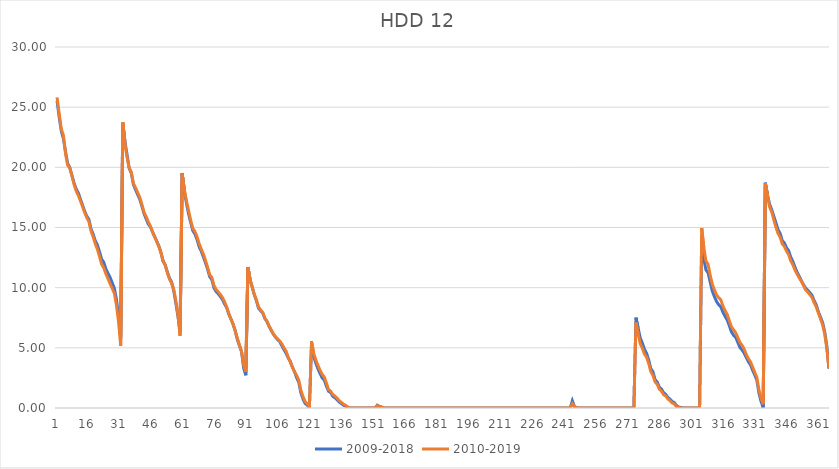
| Category | 2009-2018 | 2010-2019 |
|---|---|---|
| 0 | 25.52 | 25.81 |
| 1 | 24.18 | 24.47 |
| 2 | 23 | 23.18 |
| 3 | 22.38 | 22.66 |
| 4 | 21.29 | 21.13 |
| 5 | 20.32 | 20.18 |
| 6 | 19.98 | 19.94 |
| 7 | 19.34 | 19.31 |
| 8 | 18.72 | 18.59 |
| 9 | 18.21 | 18.03 |
| 10 | 17.87 | 17.68 |
| 11 | 17.36 | 17.23 |
| 12 | 16.86 | 16.74 |
| 13 | 16.36 | 16.25 |
| 14 | 15.95 | 15.82 |
| 15 | 15.67 | 15.5 |
| 16 | 14.88 | 14.72 |
| 17 | 14.46 | 14.23 |
| 18 | 13.91 | 13.66 |
| 19 | 13.57 | 13.2 |
| 20 | 12.99 | 12.6 |
| 21 | 12.38 | 11.96 |
| 22 | 12.12 | 11.66 |
| 23 | 11.57 | 11.15 |
| 24 | 11.2 | 10.74 |
| 25 | 10.86 | 10.33 |
| 26 | 10.4 | 9.93 |
| 27 | 9.96 | 9.53 |
| 28 | 9.03 | 8.56 |
| 29 | 7.66 | 7.17 |
| 30 | 5.83 | 5.18 |
| 31 | 23.65 | 23.74 |
| 32 | 22.16 | 21.98 |
| 33 | 21.05 | 20.85 |
| 34 | 19.93 | 19.97 |
| 35 | 19.52 | 19.6 |
| 36 | 18.57 | 18.67 |
| 37 | 18.14 | 18.32 |
| 38 | 17.74 | 17.91 |
| 39 | 17.35 | 17.51 |
| 40 | 16.77 | 16.93 |
| 41 | 16.16 | 16.27 |
| 42 | 15.72 | 15.91 |
| 43 | 15.29 | 15.48 |
| 44 | 15.06 | 15.12 |
| 45 | 14.64 | 14.65 |
| 46 | 14.24 | 14.23 |
| 47 | 13.88 | 13.82 |
| 48 | 13.45 | 13.43 |
| 49 | 12.91 | 12.91 |
| 50 | 12.21 | 12.21 |
| 51 | 11.89 | 11.86 |
| 52 | 11.31 | 11.26 |
| 53 | 10.8 | 10.72 |
| 54 | 10.47 | 10.38 |
| 55 | 9.76 | 9.88 |
| 56 | 8.74 | 8.94 |
| 57 | 7.63 | 7.78 |
| 58 | 6.33 | 6 |
| 59 | 19.5 | 19.46 |
| 60 | 18.04 | 18.18 |
| 61 | 17.04 | 17.23 |
| 62 | 16.14 | 16.43 |
| 63 | 15.43 | 15.61 |
| 64 | 14.74 | 14.94 |
| 65 | 14.46 | 14.67 |
| 66 | 14.01 | 14.25 |
| 67 | 13.4 | 13.66 |
| 68 | 13.03 | 13.21 |
| 69 | 12.56 | 12.79 |
| 70 | 12.06 | 12.26 |
| 71 | 11.53 | 11.69 |
| 72 | 10.91 | 11.08 |
| 73 | 10.66 | 10.85 |
| 74 | 9.98 | 10.18 |
| 75 | 9.68 | 9.85 |
| 76 | 9.49 | 9.65 |
| 77 | 9.27 | 9.43 |
| 78 | 9.01 | 9.19 |
| 79 | 8.64 | 8.82 |
| 80 | 8.34 | 8.38 |
| 81 | 7.8 | 7.84 |
| 82 | 7.4 | 7.38 |
| 83 | 6.96 | 6.99 |
| 84 | 6.44 | 6.4 |
| 85 | 5.7 | 5.8 |
| 86 | 5.19 | 5.24 |
| 87 | 4.67 | 4.69 |
| 88 | 3.31 | 3.56 |
| 89 | 2.72 | 3 |
| 90 | 11.71 | 11.69 |
| 91 | 10.7 | 10.69 |
| 92 | 10.07 | 10.06 |
| 93 | 9.42 | 9.44 |
| 94 | 8.92 | 8.99 |
| 95 | 8.3 | 8.4 |
| 96 | 8.08 | 8.16 |
| 97 | 7.9 | 7.93 |
| 98 | 7.44 | 7.46 |
| 99 | 7.18 | 7.21 |
| 100 | 6.77 | 6.81 |
| 101 | 6.44 | 6.49 |
| 102 | 6.14 | 6.16 |
| 103 | 5.89 | 5.92 |
| 104 | 5.69 | 5.75 |
| 105 | 5.52 | 5.58 |
| 106 | 5.18 | 5.33 |
| 107 | 4.85 | 5.01 |
| 108 | 4.55 | 4.73 |
| 109 | 4.16 | 4.22 |
| 110 | 3.87 | 3.82 |
| 111 | 3.39 | 3.36 |
| 112 | 3.01 | 3 |
| 113 | 2.51 | 2.7 |
| 114 | 2.13 | 2.3 |
| 115 | 1.25 | 1.47 |
| 116 | 0.74 | 0.94 |
| 117 | 0.38 | 0.52 |
| 118 | 0.23 | 0.35 |
| 119 | 0.05 | 0.05 |
| 120 | 5.22 | 5.55 |
| 121 | 4.27 | 4.55 |
| 122 | 3.74 | 4.01 |
| 123 | 3.27 | 3.56 |
| 124 | 2.87 | 3.14 |
| 125 | 2.51 | 2.8 |
| 126 | 2.33 | 2.58 |
| 127 | 1.83 | 2.08 |
| 128 | 1.4 | 1.54 |
| 129 | 1.3 | 1.41 |
| 130 | 0.98 | 1.12 |
| 131 | 0.85 | 0.99 |
| 132 | 0.7 | 0.83 |
| 133 | 0.5 | 0.62 |
| 134 | 0.38 | 0.48 |
| 135 | 0.24 | 0.33 |
| 136 | 0.16 | 0.23 |
| 137 | 0.05 | 0.1 |
| 138 | 0 | 0 |
| 139 | 0 | 0 |
| 140 | 0 | 0 |
| 141 | 0 | 0 |
| 142 | 0 | 0 |
| 143 | 0 | 0 |
| 144 | 0 | 0 |
| 145 | 0 | 0 |
| 146 | 0 | 0 |
| 147 | 0 | 0 |
| 148 | 0 | 0 |
| 149 | 0 | 0 |
| 150 | 0 | 0 |
| 151 | 0.23 | 0.2 |
| 152 | 0.14 | 0.1 |
| 153 | 0.08 | 0.08 |
| 154 | 0 | 0 |
| 155 | 0 | 0 |
| 156 | 0 | 0 |
| 157 | 0 | 0 |
| 158 | 0 | 0 |
| 159 | 0 | 0 |
| 160 | 0 | 0 |
| 161 | 0 | 0 |
| 162 | 0 | 0 |
| 163 | 0 | 0 |
| 164 | 0 | 0 |
| 165 | 0 | 0 |
| 166 | 0 | 0 |
| 167 | 0 | 0 |
| 168 | 0 | 0 |
| 169 | 0 | 0 |
| 170 | 0 | 0 |
| 171 | 0 | 0 |
| 172 | 0 | 0 |
| 173 | 0 | 0 |
| 174 | 0 | 0 |
| 175 | 0 | 0 |
| 176 | 0 | 0 |
| 177 | 0 | 0 |
| 178 | 0 | 0 |
| 179 | 0 | 0 |
| 180 | 0 | 0 |
| 181 | 0 | 0 |
| 182 | 0 | 0 |
| 183 | 0 | 0 |
| 184 | 0 | 0 |
| 185 | 0 | 0 |
| 186 | 0 | 0 |
| 187 | 0 | 0 |
| 188 | 0 | 0 |
| 189 | 0 | 0 |
| 190 | 0 | 0 |
| 191 | 0 | 0 |
| 192 | 0 | 0 |
| 193 | 0 | 0 |
| 194 | 0 | 0 |
| 195 | 0 | 0 |
| 196 | 0 | 0 |
| 197 | 0 | 0 |
| 198 | 0 | 0 |
| 199 | 0 | 0 |
| 200 | 0 | 0 |
| 201 | 0 | 0 |
| 202 | 0 | 0 |
| 203 | 0 | 0 |
| 204 | 0 | 0 |
| 205 | 0 | 0 |
| 206 | 0 | 0 |
| 207 | 0 | 0 |
| 208 | 0 | 0 |
| 209 | 0 | 0 |
| 210 | 0 | 0 |
| 211 | 0 | 0 |
| 212 | 0 | 0 |
| 213 | 0 | 0 |
| 214 | 0 | 0 |
| 215 | 0 | 0 |
| 216 | 0 | 0 |
| 217 | 0 | 0 |
| 218 | 0 | 0 |
| 219 | 0 | 0 |
| 220 | 0 | 0 |
| 221 | 0 | 0 |
| 222 | 0 | 0 |
| 223 | 0 | 0 |
| 224 | 0 | 0 |
| 225 | 0 | 0 |
| 226 | 0 | 0 |
| 227 | 0 | 0 |
| 228 | 0 | 0 |
| 229 | 0 | 0 |
| 230 | 0 | 0 |
| 231 | 0 | 0 |
| 232 | 0 | 0 |
| 233 | 0 | 0 |
| 234 | 0 | 0 |
| 235 | 0 | 0 |
| 236 | 0 | 0 |
| 237 | 0 | 0 |
| 238 | 0 | 0 |
| 239 | 0 | 0 |
| 240 | 0 | 0 |
| 241 | 0 | 0 |
| 242 | 0 | 0 |
| 243 | 0.6 | 0.36 |
| 244 | 0.1 | 0.1 |
| 245 | 0.03 | 0.03 |
| 246 | 0 | 0 |
| 247 | 0 | 0 |
| 248 | 0 | 0 |
| 249 | 0 | 0 |
| 250 | 0 | 0 |
| 251 | 0 | 0 |
| 252 | 0 | 0 |
| 253 | 0 | 0 |
| 254 | 0 | 0 |
| 255 | 0 | 0 |
| 256 | 0 | 0 |
| 257 | 0 | 0 |
| 258 | 0 | 0 |
| 259 | 0 | 0 |
| 260 | 0 | 0 |
| 261 | 0 | 0 |
| 262 | 0 | 0 |
| 263 | 0 | 0 |
| 264 | 0 | 0 |
| 265 | 0 | 0 |
| 266 | 0 | 0 |
| 267 | 0 | 0 |
| 268 | 0 | 0 |
| 269 | 0 | 0 |
| 270 | 0 | 0 |
| 271 | 0 | 0 |
| 272 | 0 | 0 |
| 273 | 7.51 | 7.11 |
| 274 | 6.66 | 6.18 |
| 275 | 5.83 | 5.35 |
| 276 | 5.39 | 4.97 |
| 277 | 4.89 | 4.48 |
| 278 | 4.54 | 4.23 |
| 279 | 3.99 | 3.7 |
| 280 | 3.27 | 3.02 |
| 281 | 3.02 | 2.72 |
| 282 | 2.36 | 2.17 |
| 283 | 2.17 | 1.98 |
| 284 | 1.73 | 1.57 |
| 285 | 1.58 | 1.41 |
| 286 | 1.28 | 1.11 |
| 287 | 1.14 | 1 |
| 288 | 0.89 | 0.76 |
| 289 | 0.74 | 0.62 |
| 290 | 0.55 | 0.43 |
| 291 | 0.46 | 0.35 |
| 292 | 0.23 | 0.13 |
| 293 | 0.09 | 0.04 |
| 294 | 0.04 | 0 |
| 295 | 0.01 | 0 |
| 296 | 0 | 0 |
| 297 | 0 | 0 |
| 298 | 0 | 0 |
| 299 | 0 | 0 |
| 300 | 0 | 0 |
| 301 | 0 | 0 |
| 302 | 0 | 0 |
| 303 | 0 | 0 |
| 304 | 14.01 | 14.96 |
| 305 | 12.39 | 13.32 |
| 306 | 11.47 | 12.22 |
| 307 | 11.24 | 11.94 |
| 308 | 10.46 | 11.04 |
| 309 | 9.72 | 10.28 |
| 310 | 9.25 | 9.81 |
| 311 | 8.85 | 9.4 |
| 312 | 8.59 | 9.16 |
| 313 | 8.41 | 8.99 |
| 314 | 7.96 | 8.48 |
| 315 | 7.63 | 8.1 |
| 316 | 7.32 | 7.78 |
| 317 | 6.85 | 7.26 |
| 318 | 6.33 | 6.76 |
| 319 | 6.05 | 6.5 |
| 320 | 5.87 | 6.26 |
| 321 | 5.47 | 5.86 |
| 322 | 5.04 | 5.46 |
| 323 | 4.83 | 5.22 |
| 324 | 4.57 | 4.91 |
| 325 | 4.21 | 4.47 |
| 326 | 3.85 | 4.1 |
| 327 | 3.59 | 3.84 |
| 328 | 3.14 | 3.41 |
| 329 | 2.75 | 2.97 |
| 330 | 2.32 | 2.55 |
| 331 | 1.23 | 1.49 |
| 332 | 0.54 | 0.8 |
| 333 | 0.03 | 0.32 |
| 334 | 18.72 | 18.66 |
| 335 | 17.72 | 17.69 |
| 336 | 16.95 | 16.72 |
| 337 | 16.48 | 16.29 |
| 338 | 15.94 | 15.64 |
| 339 | 15.39 | 15.03 |
| 340 | 14.82 | 14.51 |
| 341 | 14.5 | 14.18 |
| 342 | 13.9 | 13.63 |
| 343 | 13.71 | 13.43 |
| 344 | 13.32 | 13.03 |
| 345 | 13.07 | 12.75 |
| 346 | 12.54 | 12.23 |
| 347 | 12.16 | 11.9 |
| 348 | 11.7 | 11.46 |
| 349 | 11.28 | 11.12 |
| 350 | 10.94 | 10.81 |
| 351 | 10.58 | 10.53 |
| 352 | 10.25 | 10.18 |
| 353 | 9.96 | 9.82 |
| 354 | 9.79 | 9.64 |
| 355 | 9.59 | 9.42 |
| 356 | 9.37 | 9.2 |
| 357 | 8.93 | 8.76 |
| 358 | 8.58 | 8.41 |
| 359 | 8 | 7.9 |
| 360 | 7.57 | 7.42 |
| 361 | 7.11 | 6.91 |
| 362 | 6.34 | 6.16 |
| 363 | 5.15 | 4.92 |
| 364 | 3.27 | 3.3 |